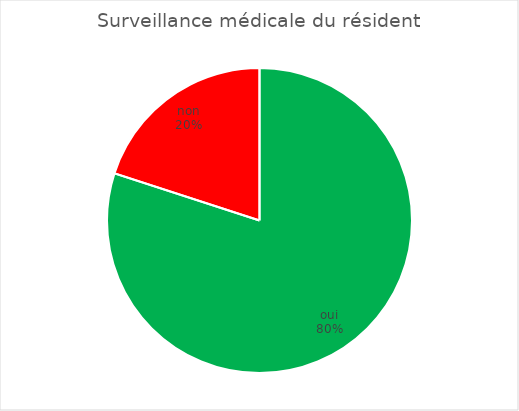
| Category | Surveillance médicale du résident |
|---|---|
| oui | 12 |
| non | 3 |